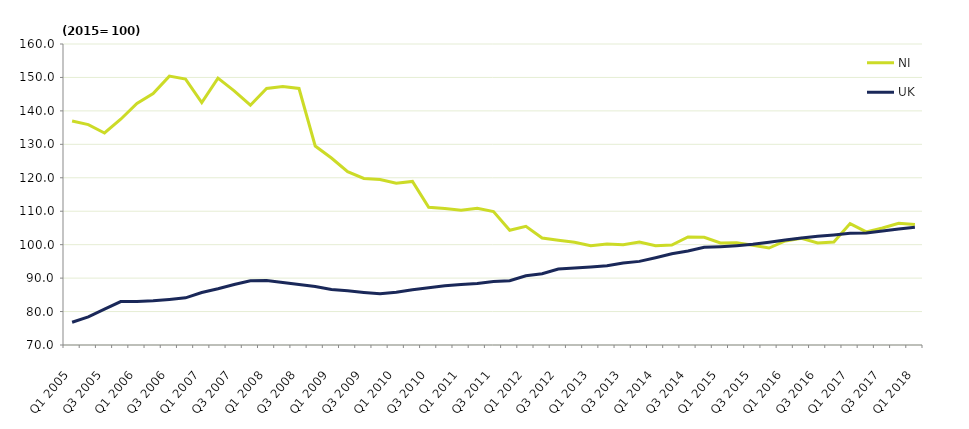
| Category | NI | UK |
|---|---|---|
| Q1 2005 | 137 | 76.8 |
| Q2 2005 | 135.9 | 78.4 |
| Q3 2005 | 133.4 | 80.7 |
| Q4 2005 | 137.5 | 83 |
| Q1 2006 | 142.2 | 83 |
| Q2 2006 | 145.2 | 83.2 |
| Q3 2006 | 150.4 | 83.6 |
| Q4 2006 | 149.5 | 84.1 |
| Q1 2007 | 142.5 | 85.7 |
| Q2 2007 | 149.8 | 86.8 |
| Q3 2007 | 146 | 88.1 |
| Q4 2007 | 141.7 | 89.2 |
| Q1 2008 | 146.7 | 89.3 |
| Q2 2008 | 147.3 | 88.7 |
| Q3 2008 | 146.7 | 88.1 |
| Q4 2008 | 129.5 | 87.5 |
| Q1 2009 | 125.9 | 86.6 |
| Q2 2009 | 121.8 | 86.2 |
| Q3 2009 | 119.8 | 85.7 |
| Q4 2009 | 119.5 | 85.3 |
| Q1 2010 | 118.4 | 85.8 |
| Q2 2010 | 118.9 | 86.5 |
| Q3 2010 | 111.2 | 87.1 |
| Q4 2010 | 110.8 | 87.7 |
| Q1 2011 | 110.3 | 88.1 |
| Q2 2011 | 110.9 | 88.4 |
| Q3 2011 | 109.9 | 89 |
| Q4 2011 | 104.3 | 89.2 |
| Q1 2012 | 105.5 | 90.7 |
| Q2 2012 | 102 | 91.3 |
| Q3 2012 | 101.3 | 92.7 |
| Q4 2012 | 100.7 | 93 |
| Q1 2013 | 99.7 | 93.3 |
| Q2 2013 | 100.2 | 93.7 |
| Q3 2013 | 100 | 94.5 |
| Q4 2013 | 100.8 | 95 |
| Q1 2014 | 99.7 | 96.1 |
| Q2 2014 | 99.9 | 97.3 |
| Q3 2014 | 102.3 | 98.1 |
| Q4 2014 | 102.2 | 99.2 |
| Q1 2015 | 100.5 | 99.4 |
| Q2 2015 | 100.6 | 99.7 |
| Q3 2015 | 99.8 | 100.1 |
| Q4 2015 | 99 | 100.7 |
| Q1 2016 | 101.1 | 101.4 |
| Q2 2016 | 101.9 | 102 |
| Q3 2016 | 100.5 | 102.5 |
| Q4 2016 | 100.8 | 102.9 |
| Q1 2017 | 106.3 | 103.4 |
| Q2 2017 | 103.8 | 103.5 |
| Q3 2017 | 105 | 104.1 |
| Q4 2017 | 106.4 | 104.7 |
| Q1 2018 | 106 | 105.2 |